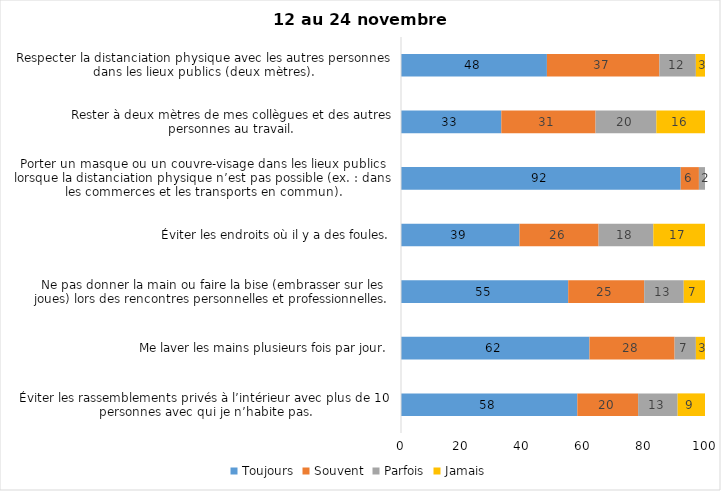
| Category | Toujours | Souvent | Parfois | Jamais |
|---|---|---|---|---|
| Éviter les rassemblements privés à l’intérieur avec plus de 10 personnes avec qui je n’habite pas. | 58 | 20 | 13 | 9 |
| Me laver les mains plusieurs fois par jour. | 62 | 28 | 7 | 3 |
| Ne pas donner la main ou faire la bise (embrasser sur les joues) lors des rencontres personnelles et professionnelles. | 55 | 25 | 13 | 7 |
| Éviter les endroits où il y a des foules. | 39 | 26 | 18 | 17 |
| Porter un masque ou un couvre-visage dans les lieux publics lorsque la distanciation physique n’est pas possible (ex. : dans les commerces et les transports en commun). | 92 | 6 | 2 | 0 |
| Rester à deux mètres de mes collègues et des autres personnes au travail. | 33 | 31 | 20 | 16 |
| Respecter la distanciation physique avec les autres personnes dans les lieux publics (deux mètres). | 48 | 37 | 12 | 3 |